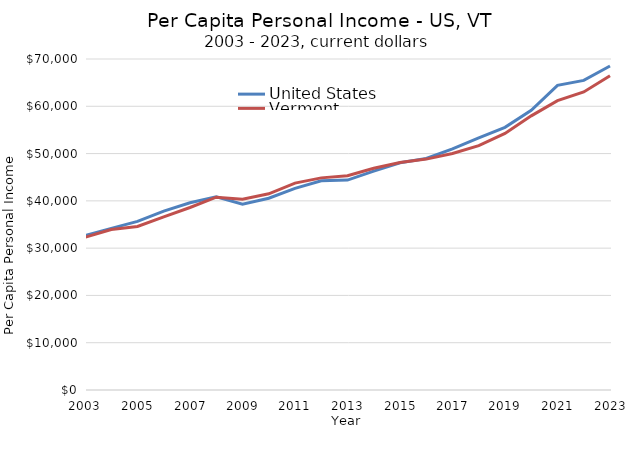
| Category | United States | Vermont |
|---|---|---|
| 2023 | 68531 | 66463 |
| 2022 | 65473 | 63035 |
| 2021 | 64427 | 61202 |
| 2020 | 59151 | 57974 |
| 2019 | 55547 | 54257 |
| 2018 | 53309 | 51692 |
| 2017 | 51004 | 50011 |
| 2016 | 48971 | 48831 |
| 2015 | 48060 | 48120 |
| 2014 | 46287 | 46897 |
| 2013 | 44401 | 45298 |
| 2012 | 44237 | 44861 |
| 2011 | 42649 | 43756 |
| 2010 | 40557 | 41492 |
| 2009 | 39307 | 40358 |
| 2008 | 40854 | 40774 |
| 2007 | 39588 | 38595 |
| 2006 | 37843 | 36609 |
| 2005 | 35669 | 34573 |
| 2004 | 34183 | 33955 |
| 2003 | 32659 | 32282 |